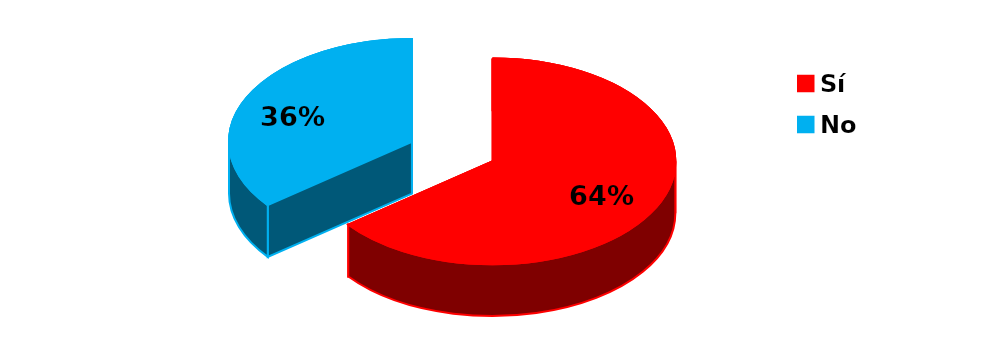
| Category | Series 0 |
|---|---|
| Sí | 29 |
| No | 16 |